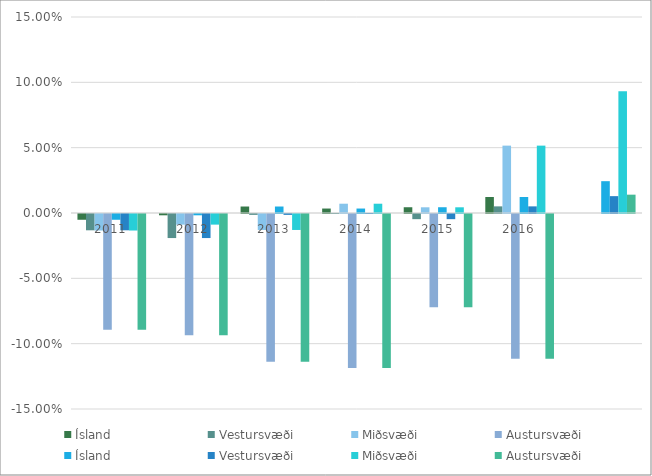
| Category | Ísland | Vestursvæði | Miðsvæði | Austursvæði |
|---|---|---|---|---|
| 2011.0 | -0.004 | -0.012 | -0.013 | -0.089 |
| 2012.0 | -0.001 | -0.018 | -0.008 | -0.093 |
| 2013.0 | 0.005 | -0.001 | -0.012 | -0.113 |
| 2014.0 | 0.003 | 0 | 0.007 | -0.118 |
| 2015.0 | 0.004 | -0.004 | 0.004 | -0.071 |
| 2016.0 | 0.012 | 0.005 | 0.052 | -0.111 |